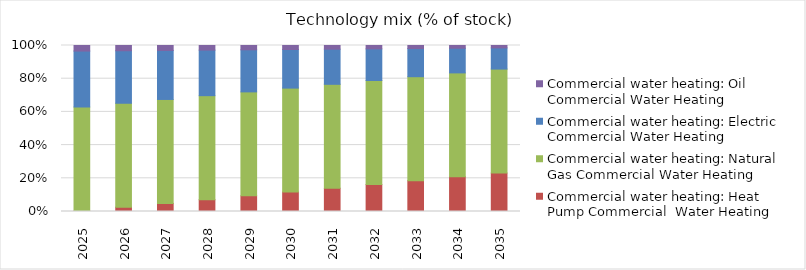
| Category | Commercial water heating: Heat Pump Commercial  Water Heating | Commercial water heating: Natural Gas Commercial Water Heating | Commercial water heating: Electric Commercial Water Heating | Commercial water heating: Oil Commercial Water Heating |
|---|---|---|---|---|
| 2025.0 | 0.003 | 0.626 | 0.337 | 0.034 |
| 2026.0 | 0.026 | 0.626 | 0.316 | 0.032 |
| 2027.0 | 0.049 | 0.626 | 0.295 | 0.03 |
| 2028.0 | 0.072 | 0.626 | 0.274 | 0.028 |
| 2029.0 | 0.094 | 0.626 | 0.253 | 0.026 |
| 2030.0 | 0.117 | 0.626 | 0.232 | 0.024 |
| 2031.0 | 0.14 | 0.626 | 0.212 | 0.022 |
| 2032.0 | 0.163 | 0.626 | 0.191 | 0.02 |
| 2033.0 | 0.186 | 0.626 | 0.17 | 0.018 |
| 2034.0 | 0.209 | 0.626 | 0.149 | 0.016 |
| 2035.0 | 0.232 | 0.626 | 0.128 | 0.014 |